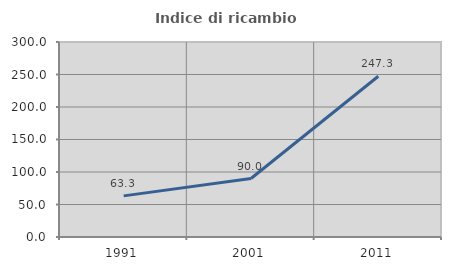
| Category | Indice di ricambio occupazionale  |
|---|---|
| 1991.0 | 63.278 |
| 2001.0 | 89.961 |
| 2011.0 | 247.335 |